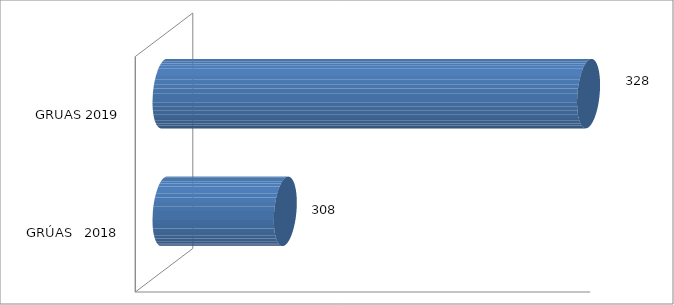
| Category | NOVIEMBRE |
|---|---|
| GRÚAS   2018 | 308 |
| GRUAS 2019 | 328 |